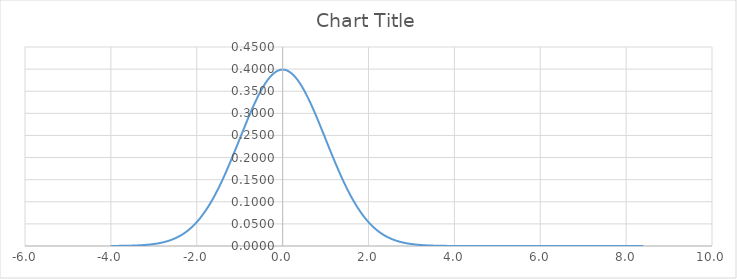
| Category | Series 0 |
|---|---|
| -4.0 | 0 |
| -3.9 | 0 |
| -3.8 | 0 |
| -3.7 | 0 |
| -3.6 | 0.001 |
| -3.5 | 0.001 |
| -3.4 | 0.001 |
| -3.3 | 0.002 |
| -3.2 | 0.002 |
| -3.1 | 0.003 |
| -3.0 | 0.004 |
| -2.9 | 0.006 |
| -2.8 | 0.008 |
| -2.7 | 0.01 |
| -2.6 | 0.014 |
| -2.5 | 0.018 |
| -2.4 | 0.022 |
| -2.3 | 0.028 |
| -2.2 | 0.035 |
| -2.1 | 0.044 |
| -2.0 | 0.054 |
| -1.9 | 0.066 |
| -1.8 | 0.079 |
| -1.7 | 0.094 |
| -1.6 | 0.111 |
| -1.5 | 0.13 |
| -1.4 | 0.15 |
| -1.3 | 0.171 |
| -1.2 | 0.194 |
| -1.1 | 0.218 |
| -1.0 | 0.242 |
| -0.9 | 0.266 |
| -0.8 | 0.29 |
| -0.7 | 0.312 |
| -0.6 | 0.333 |
| -0.5 | 0.352 |
| -0.4 | 0.368 |
| -0.3 | 0.381 |
| -0.2 | 0.391 |
| -0.1 | 0.397 |
| 0.0 | 0.399 |
| 0.0999999999999996 | 0.397 |
| 0.2 | 0.391 |
| 0.3 | 0.381 |
| 0.4 | 0.368 |
| 0.5 | 0.352 |
| 0.6 | 0.333 |
| 0.7 | 0.312 |
| 0.8 | 0.29 |
| 0.9 | 0.266 |
| 1.0 | 0.242 |
| 1.1 | 0.218 |
| 1.2 | 0.194 |
| 1.3 | 0.171 |
| 1.4 | 0.15 |
| 1.50000000000001 | 0.13 |
| 1.6 | 0.111 |
| 1.7 | 0.094 |
| 1.80000000000001 | 0.079 |
| 1.90000000000001 | 0.066 |
| 2.00000000000001 | 0.054 |
| 2.1 | 0.044 |
| 2.20000000000001 | 0.035 |
| 2.30000000000001 | 0.028 |
| 2.40000000000001 | 0.022 |
| 2.50000000000001 | 0.018 |
| 2.60000000000001 | 0.014 |
| 2.70000000000001 | 0.01 |
| 2.80000000000001 | 0.008 |
| 2.90000000000001 | 0.006 |
| 3.00000000000001 | 0.004 |
| 3.10000000000001 | 0.003 |
| 3.20000000000001 | 0.002 |
| 3.30000000000001 | 0.002 |
| 3.40000000000001 | 0.001 |
| 3.50000000000001 | 0.001 |
| 3.60000000000001 | 0.001 |
| 3.70000000000001 | 0 |
| 3.80000000000001 | 0 |
| 3.90000000000001 | 0 |
| 4.00000000000001 | 0 |
| 4.10000000000001 | 0 |
| 4.20000000000001 | 0 |
| 4.30000000000001 | 0 |
| 4.40000000000001 | 0 |
| 4.50000000000001 | 0 |
| 4.60000000000001 | 0 |
| 4.70000000000001 | 0 |
| 4.80000000000001 | 0 |
| 4.90000000000001 | 0 |
| 5.00000000000001 | 0 |
| 5.10000000000001 | 0 |
| 5.20000000000001 | 0 |
| 5.30000000000001 | 0 |
| 5.40000000000001 | 0 |
| 5.50000000000001 | 0 |
| 5.60000000000001 | 0 |
| 5.70000000000001 | 0 |
| 5.80000000000001 | 0 |
| 5.90000000000001 | 0 |
| 6.00000000000001 | 0 |
| 6.10000000000001 | 0 |
| 6.20000000000001 | 0 |
| 6.30000000000001 | 0 |
| 6.40000000000001 | 0 |
| 6.50000000000001 | 0 |
| 6.60000000000001 | 0 |
| 6.70000000000001 | 0 |
| 6.80000000000001 | 0 |
| 6.90000000000001 | 0 |
| 7.00000000000001 | 0 |
| 7.10000000000001 | 0 |
| 7.20000000000001 | 0 |
| 7.30000000000001 | 0 |
| 7.40000000000001 | 0 |
| 7.50000000000001 | 0 |
| 7.60000000000001 | 0 |
| 7.70000000000001 | 0 |
| 7.80000000000001 | 0 |
| 7.90000000000001 | 0 |
| 8.00000000000001 | 0 |
| 8.10000000000001 | 0 |
| 8.20000000000001 | 0 |
| 8.30000000000001 | 0 |
| 8.40000000000001 | 0 |